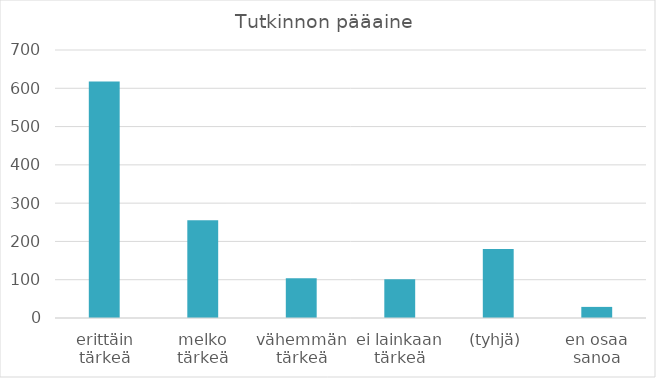
| Category | Summa |
|---|---|
| erittäin tärkeä | 618 |
| melko tärkeä | 255 |
| vähemmän tärkeä | 104 |
| ei lainkaan tärkeä | 101 |
| (tyhjä) | 180 |
| en osaa sanoa | 29 |